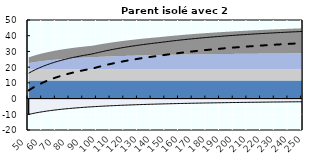
| Category | Coin fiscal moyen (somme des composantes) | Taux moyen d'imposition net en % du salaire brut |
|---|---|---|
| 50.0 | 16.114 | 5.209 |
| 51.0 | 16.614 | 5.774 |
| 52.0 | 17.094 | 6.316 |
| 53.0 | 17.556 | 6.839 |
| 54.0 | 18.002 | 7.342 |
| 55.0 | 18.43 | 7.826 |
| 56.0 | 18.844 | 8.294 |
| 57.0 | 19.243 | 8.745 |
| 58.0 | 19.629 | 9.18 |
| 59.0 | 20.001 | 9.601 |
| 60.0 | 20.361 | 10.008 |
| 61.0 | 20.709 | 10.401 |
| 62.0 | 21.046 | 10.782 |
| 63.0 | 21.372 | 11.15 |
| 64.0 | 21.688 | 11.507 |
| 65.0 | 21.994 | 11.853 |
| 66.0 | 22.291 | 12.189 |
| 67.0 | 22.579 | 12.514 |
| 68.0 | 22.859 | 12.83 |
| 69.0 | 23.13 | 13.137 |
| 70.0 | 23.394 | 13.435 |
| 71.0 | 23.65 | 13.725 |
| 72.0 | 23.899 | 14.006 |
| 73.0 | 24.142 | 14.28 |
| 74.0 | 24.378 | 14.547 |
| 75.0 | 24.607 | 14.806 |
| 76.0 | 24.831 | 15.059 |
| 77.0 | 25.048 | 15.305 |
| 78.0 | 25.26 | 15.544 |
| 79.0 | 25.467 | 15.778 |
| 80.0 | 25.669 | 16.006 |
| 81.0 | 25.865 | 16.228 |
| 82.0 | 26.057 | 16.445 |
| 83.0 | 26.244 | 16.656 |
| 84.0 | 26.427 | 16.863 |
| 85.0 | 26.605 | 17.064 |
| 86.0 | 26.78 | 17.261 |
| 87.0 | 26.95 | 17.453 |
| 88.0 | 27.116 | 17.642 |
| 89.0 | 27.279 | 17.825 |
| 90.0 | 27.438 | 18.005 |
| 91.0 | 27.594 | 18.181 |
| 92.0 | 27.746 | 18.353 |
| 93.0 | 27.895 | 18.521 |
| 94.0 | 28.04 | 18.686 |
| 95.0 | 28.183 | 18.847 |
| 96.0 | 28.323 | 19.005 |
| 97.0 | 28.49 | 19.193 |
| 98.0 | 28.708 | 19.44 |
| 99.0 | 28.922 | 19.682 |
| 100.0 | 29.132 | 19.919 |
| 101.0 | 29.338 | 20.152 |
| 102.0 | 29.54 | 20.38 |
| 103.0 | 29.737 | 20.603 |
| 104.0 | 29.931 | 20.823 |
| 105.0 | 30.122 | 21.038 |
| 106.0 | 30.308 | 21.249 |
| 107.0 | 30.492 | 21.456 |
| 108.0 | 30.671 | 21.659 |
| 109.0 | 30.848 | 21.858 |
| 110.0 | 31.021 | 22.054 |
| 111.0 | 31.191 | 22.246 |
| 112.0 | 31.359 | 22.435 |
| 113.0 | 31.523 | 22.621 |
| 114.0 | 31.684 | 22.803 |
| 115.0 | 31.843 | 22.982 |
| 116.0 | 31.998 | 23.158 |
| 117.0 | 32.151 | 23.331 |
| 118.0 | 32.302 | 23.501 |
| 119.0 | 32.45 | 23.668 |
| 120.0 | 32.595 | 23.833 |
| 121.0 | 32.739 | 23.995 |
| 122.0 | 32.879 | 24.154 |
| 123.0 | 33.018 | 24.31 |
| 124.0 | 33.154 | 24.464 |
| 125.0 | 33.288 | 24.616 |
| 126.0 | 33.42 | 24.765 |
| 127.0 | 33.55 | 24.911 |
| 128.0 | 33.678 | 25.056 |
| 129.0 | 33.804 | 25.198 |
| 130.0 | 33.927 | 25.338 |
| 131.0 | 34.049 | 25.476 |
| 132.0 | 34.17 | 25.612 |
| 133.0 | 34.288 | 25.745 |
| 134.0 | 34.405 | 25.877 |
| 135.0 | 34.519 | 26.007 |
| 136.0 | 34.633 | 26.135 |
| 137.0 | 34.744 | 26.261 |
| 138.0 | 34.854 | 26.385 |
| 139.0 | 34.962 | 26.508 |
| 140.0 | 35.069 | 26.628 |
| 141.0 | 35.174 | 26.747 |
| 142.0 | 35.278 | 26.864 |
| 143.0 | 35.381 | 26.98 |
| 144.0 | 35.481 | 27.094 |
| 145.0 | 35.581 | 27.207 |
| 146.0 | 35.688 | 27.328 |
| 147.0 | 35.803 | 27.457 |
| 148.0 | 35.916 | 27.585 |
| 149.0 | 36.028 | 27.712 |
| 150.0 | 36.138 | 27.836 |
| 151.0 | 36.247 | 27.959 |
| 152.0 | 36.354 | 28.081 |
| 153.0 | 36.46 | 28.2 |
| 154.0 | 36.565 | 28.318 |
| 155.0 | 36.668 | 28.435 |
| 156.0 | 36.77 | 28.55 |
| 157.0 | 36.871 | 28.664 |
| 158.0 | 36.97 | 28.776 |
| 159.0 | 37.068 | 28.887 |
| 160.0 | 37.165 | 28.997 |
| 161.0 | 37.261 | 29.105 |
| 162.0 | 37.355 | 29.211 |
| 163.0 | 37.449 | 29.317 |
| 164.0 | 37.541 | 29.421 |
| 165.0 | 37.632 | 29.524 |
| 166.0 | 37.722 | 29.626 |
| 167.0 | 37.811 | 29.726 |
| 168.0 | 37.898 | 29.825 |
| 169.0 | 37.985 | 29.923 |
| 170.0 | 38.071 | 30.02 |
| 171.0 | 38.156 | 30.116 |
| 172.0 | 38.24 | 30.211 |
| 173.0 | 38.322 | 30.304 |
| 174.0 | 38.404 | 30.397 |
| 175.0 | 38.485 | 30.488 |
| 176.0 | 38.565 | 30.579 |
| 177.0 | 38.644 | 30.668 |
| 178.0 | 38.722 | 30.756 |
| 179.0 | 38.8 | 30.844 |
| 180.0 | 38.876 | 30.93 |
| 181.0 | 38.952 | 31.016 |
| 182.0 | 39.027 | 31.1 |
| 183.0 | 39.101 | 31.184 |
| 184.0 | 39.174 | 31.267 |
| 185.0 | 39.246 | 31.348 |
| 186.0 | 39.318 | 31.429 |
| 187.0 | 39.389 | 31.509 |
| 188.0 | 39.459 | 31.589 |
| 189.0 | 39.528 | 31.667 |
| 190.0 | 39.597 | 31.744 |
| 191.0 | 39.665 | 31.821 |
| 192.0 | 39.732 | 31.897 |
| 193.0 | 39.798 | 31.972 |
| 194.0 | 39.864 | 32.047 |
| 195.0 | 39.929 | 32.12 |
| 196.0 | 39.994 | 32.193 |
| 197.0 | 40.058 | 32.265 |
| 198.0 | 40.121 | 32.337 |
| 199.0 | 40.183 | 32.407 |
| 200.0 | 40.245 | 32.477 |
| 201.0 | 40.307 | 32.546 |
| 202.0 | 40.367 | 32.615 |
| 203.0 | 40.427 | 32.683 |
| 204.0 | 40.487 | 32.75 |
| 205.0 | 40.546 | 32.817 |
| 206.0 | 40.604 | 32.883 |
| 207.0 | 40.662 | 32.948 |
| 208.0 | 40.719 | 33.013 |
| 209.0 | 40.776 | 33.077 |
| 210.0 | 40.832 | 33.14 |
| 211.0 | 40.888 | 33.203 |
| 212.0 | 40.943 | 33.265 |
| 213.0 | 40.997 | 33.327 |
| 214.0 | 41.051 | 33.388 |
| 215.0 | 41.105 | 33.449 |
| 216.0 | 41.158 | 33.509 |
| 217.0 | 41.211 | 33.568 |
| 218.0 | 41.263 | 33.627 |
| 219.0 | 41.314 | 33.685 |
| 220.0 | 41.365 | 33.743 |
| 221.0 | 41.416 | 33.8 |
| 222.0 | 41.466 | 33.857 |
| 223.0 | 41.516 | 33.913 |
| 224.0 | 41.565 | 33.969 |
| 225.0 | 41.614 | 34.024 |
| 226.0 | 41.663 | 34.079 |
| 227.0 | 41.711 | 34.133 |
| 228.0 | 41.758 | 34.187 |
| 229.0 | 41.806 | 34.24 |
| 230.0 | 41.852 | 34.293 |
| 231.0 | 41.899 | 34.346 |
| 232.0 | 41.945 | 34.398 |
| 233.0 | 41.99 | 34.449 |
| 234.0 | 42.036 | 34.5 |
| 235.0 | 42.08 | 34.551 |
| 236.0 | 42.125 | 34.601 |
| 237.0 | 42.169 | 34.651 |
| 238.0 | 42.213 | 34.7 |
| 239.0 | 42.256 | 34.749 |
| 240.0 | 42.299 | 34.798 |
| 241.0 | 42.341 | 34.846 |
| 242.0 | 42.384 | 34.894 |
| 243.0 | 42.426 | 34.941 |
| 244.0 | 42.467 | 34.988 |
| 245.0 | 42.508 | 35.034 |
| 246.0 | 42.549 | 35.081 |
| 247.0 | 42.59 | 35.126 |
| 248.0 | 42.63 | 35.172 |
| 249.0 | 42.67 | 35.217 |
| 250.0 | 42.71 | 35.262 |